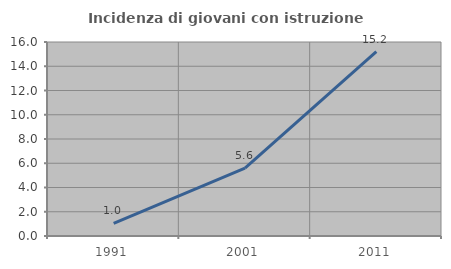
| Category | Incidenza di giovani con istruzione universitaria |
|---|---|
| 1991.0 | 1.047 |
| 2001.0 | 5.603 |
| 2011.0 | 15.214 |